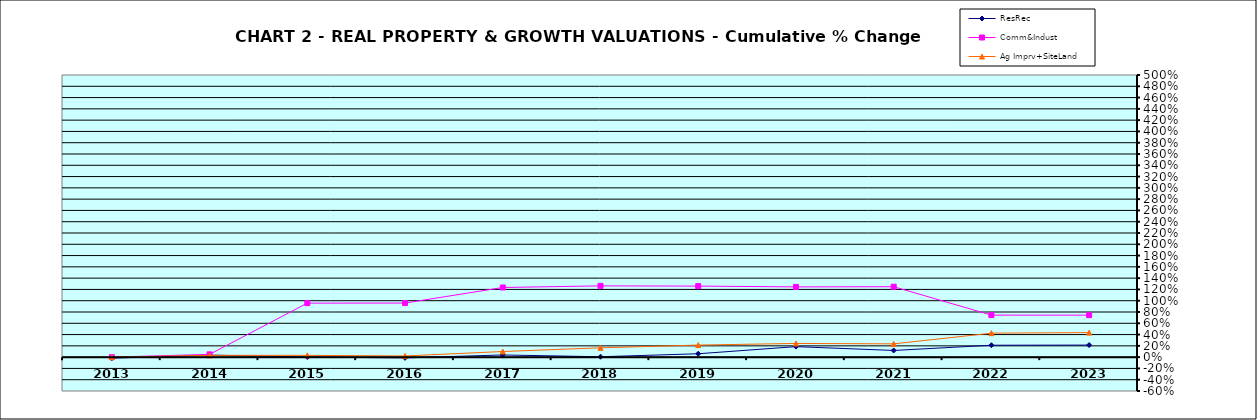
| Category | ResRec | Comm&Indust | Ag Imprv+SiteLand |
|---|---|---|---|
| 2013.0 | -0.018 | 0 | 0 |
| 2014.0 | 0.036 | 0.049 | 0.032 |
| 2015.0 | 0.002 | 0.957 | 0.032 |
| 2016.0 | -0.013 | 0.959 | 0.021 |
| 2017.0 | 0.039 | 1.234 | 0.1 |
| 2018.0 | 0.007 | 1.263 | 0.165 |
| 2019.0 | 0.06 | 1.259 | 0.214 |
| 2020.0 | 0.186 | 1.245 | 0.243 |
| 2021.0 | 0.118 | 1.248 | 0.235 |
| 2022.0 | 0.211 | 0.745 | 0.425 |
| 2023.0 | 0.214 | 0.744 | 0.435 |